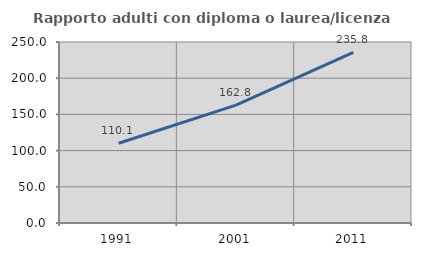
| Category | Rapporto adulti con diploma o laurea/licenza media  |
|---|---|
| 1991.0 | 110.098 |
| 2001.0 | 162.792 |
| 2011.0 | 235.789 |